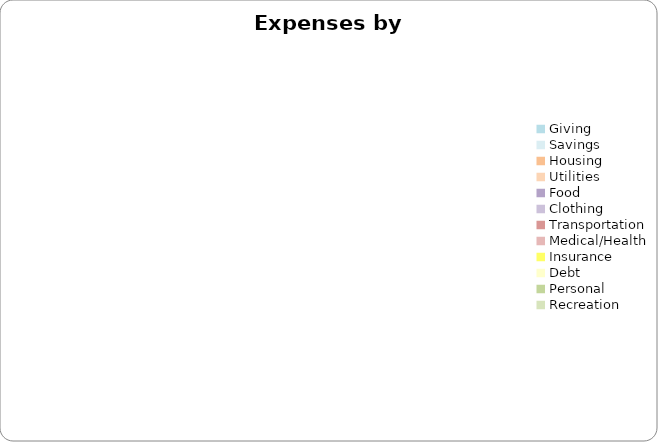
| Category | Series 0 |
|---|---|
| Giving | 0 |
| Savings | 0 |
| Housing | 0 |
| Utilities | 0 |
| Food | 0 |
| Clothing | 0 |
| Transportation | 0 |
| Medical/Health | 0 |
| Insurance | 0 |
| Debt | 0 |
| Personal | 0 |
| Recreation | 0 |